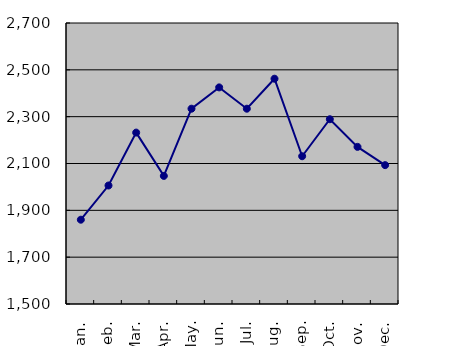
| Category | Series 0 |
|---|---|
| Jan. | 1860 |
| Feb. | 2006 |
| Mar. | 2232 |
| Apr. | 2047 |
| May. | 2334 |
| Jun. | 2425 |
| Jul. | 2334 |
| Aug. | 2462 |
| Sep. | 2131 |
| Oct. | 2289 |
| Nov. | 2171 |
| Dec. | 2093 |